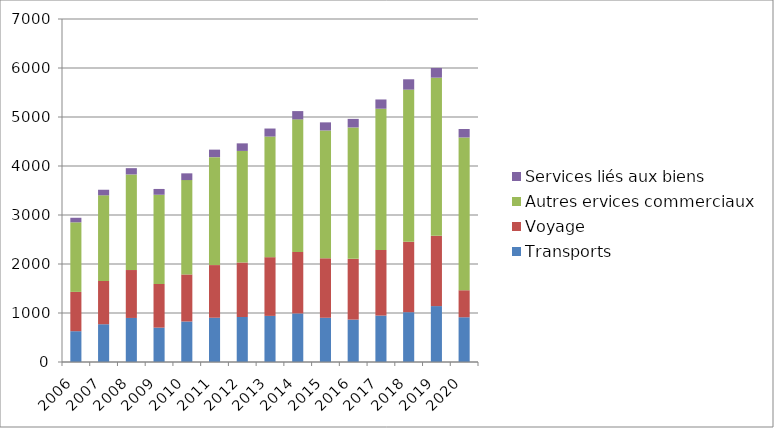
| Category | Transports | Voyage | Autres ervices commerciaux | Services liés aux biens |
|---|---|---|---|---|
| 2006.0 | 628.777 | 801.907 | 1419.965 | 92.714 |
| 2007.0 | 770.835 | 883.65 | 1747.256 | 113.527 |
| 2008.0 | 899.026 | 977.942 | 1950.719 | 128.246 |
| 2009.0 | 701.4 | 891.462 | 1820.424 | 118.288 |
| 2010.0 | 826.845 | 959.922 | 1925.838 | 137.495 |
| 2011.0 | 903.721 | 1073.826 | 2203.341 | 153.058 |
| 2012.0 | 918.533 | 1111.592 | 2277.552 | 154.368 |
| 2013.0 | 941.007 | 1198.351 | 2461.72 | 163.608 |
| 2014.0 | 991.388 | 1253.837 | 2706.356 | 168.989 |
| 2015.0 | 902.79 | 1213.831 | 2608.441 | 165.509 |
| 2016.0 | 865.905 | 1239.049 | 2681.923 | 174.618 |
| 2017.0 | 947.575 | 1339.441 | 2881.999 | 188.692 |
| 2018.0 | 1016.599 | 1436.521 | 3105.576 | 210.975 |
| 2019.0 | 1140.96 | 1434.51 | 3227.026 | 198.254 |
| 2020.0 | 912.97 | 551.66 | 3117.709 | 172.764 |